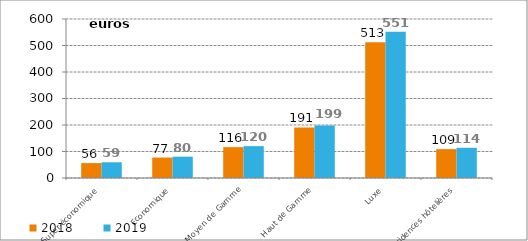
| Category | 2018 | 2019 |
|---|---|---|
| Super-économique | 56.281 | 59.285 |
| Economique | 77.174 | 80.469 |
| Moyen de Gamme | 116.315 | 120.202 |
| Haut de Gamme | 190.907 | 198.582 |
| Luxe | 512.524 | 551.487 |
| Résidences hôtelières | 108.993 | 113.978 |